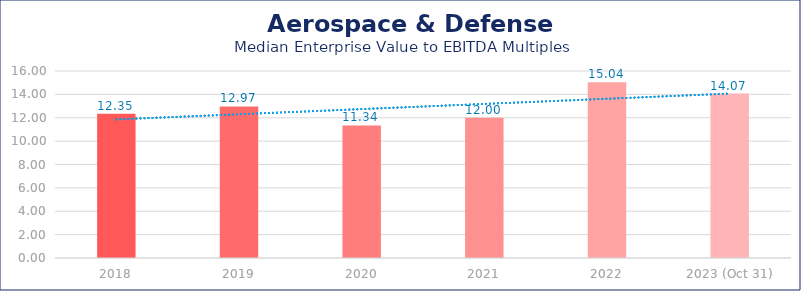
| Category | Aerospace & Defense |
|---|---|
| 2018 | 12.35 |
| 2019 | 12.97 |
| 2020 | 11.34 |
| 2021 | 12 |
| 2022 | 15.04 |
| 2023 (Oct 31) | 14.07 |